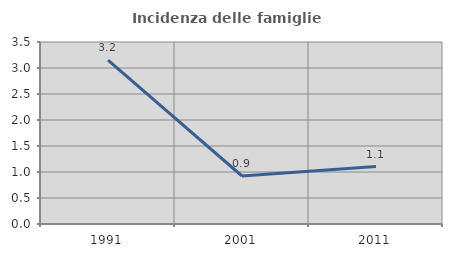
| Category | Incidenza delle famiglie numerose |
|---|---|
| 1991.0 | 3.151 |
| 2001.0 | 0.923 |
| 2011.0 | 1.105 |